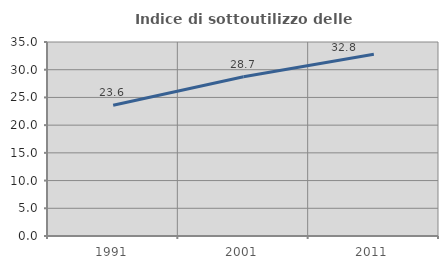
| Category | Indice di sottoutilizzo delle abitazioni  |
|---|---|
| 1991.0 | 23.593 |
| 2001.0 | 28.72 |
| 2011.0 | 32.78 |